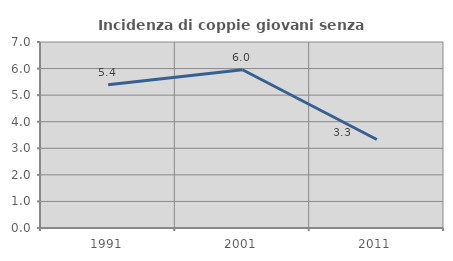
| Category | Incidenza di coppie giovani senza figli |
|---|---|
| 1991.0 | 5.392 |
| 2001.0 | 5.954 |
| 2011.0 | 3.331 |